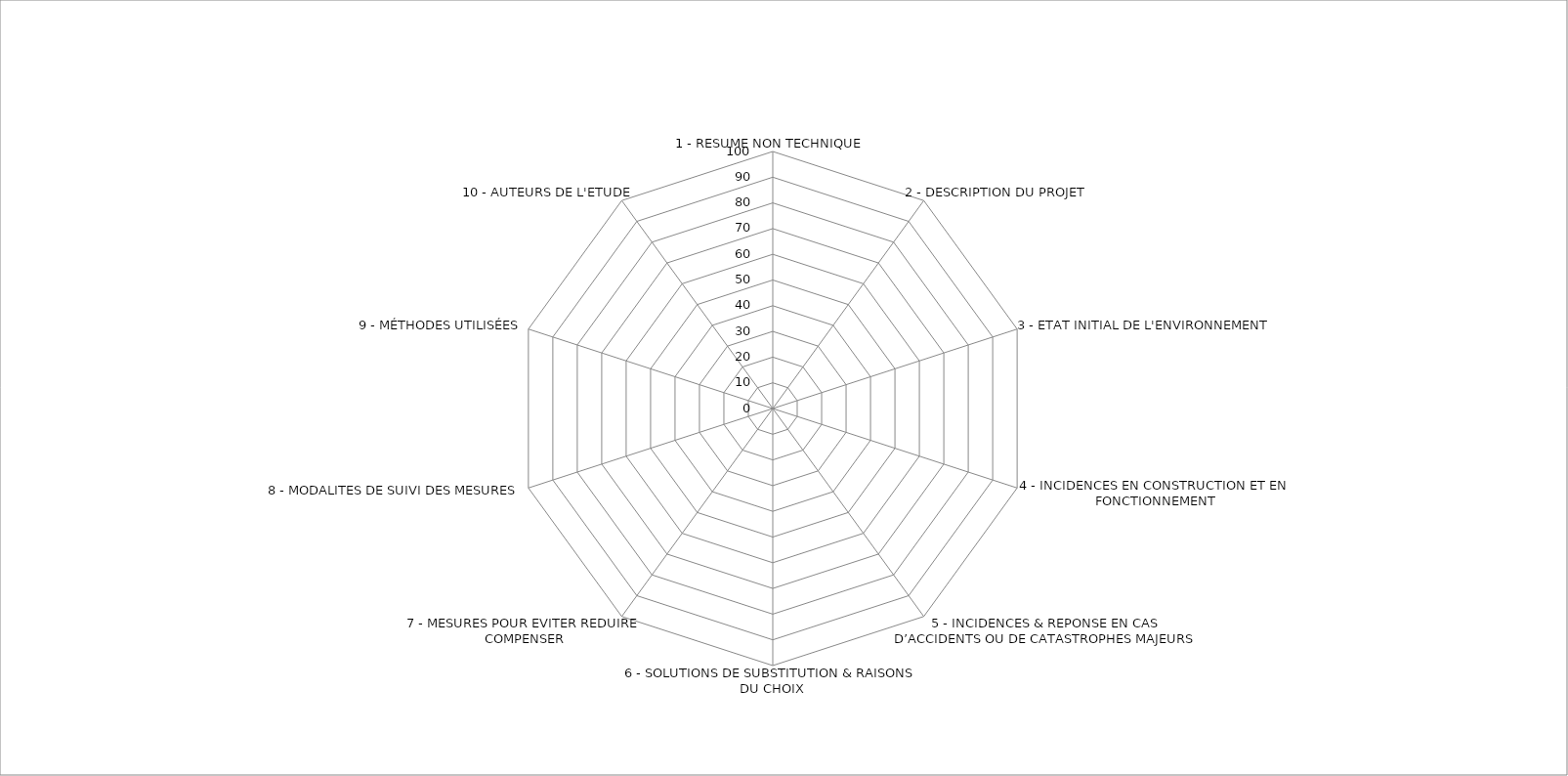
| Category | 0 0 0 0 0 0 0 0 0 0 |
|---|---|
| 1 - RESUME NON TECHNIQUE | 0 |
| 2 - DESCRIPTION DU PROJET | 0 |
| 3 - ETAT INITIAL DE L'ENVIRONNEMENT | 0 |
| 4 - INCIDENCES EN CONSTRUCTION ET EN FONCTIONNEMENT | 0 |
| 5 - INCIDENCES & REPONSE EN CAS D’ACCIDENTS OU DE CATASTROPHES MAJEURS | 0 |
| 6 - SOLUTIONS DE SUBSTITUTION & RAISONS DU CHOIX | 0 |
| 7 - MESURES POUR EVITER REDUIRE COMPENSER | 0 |
| 8 - MODALITES DE SUIVI DES MESURES | 0 |
| 9 - MÉTHODES UTILISÉES | 0 |
| 10 - AUTEURS DE L'ETUDE | 0 |